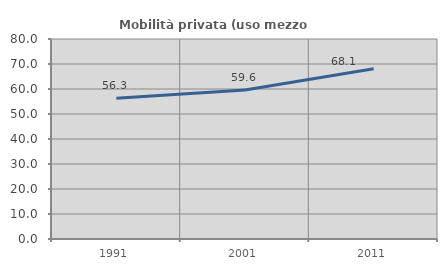
| Category | Mobilità privata (uso mezzo privato) |
|---|---|
| 1991.0 | 56.307 |
| 2001.0 | 59.573 |
| 2011.0 | 68.129 |